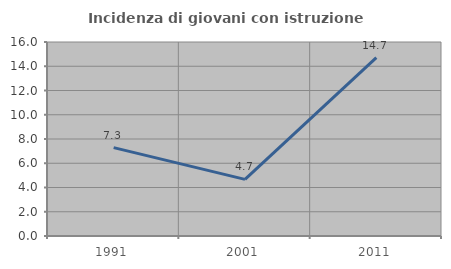
| Category | Incidenza di giovani con istruzione universitaria |
|---|---|
| 1991.0 | 7.292 |
| 2001.0 | 4.673 |
| 2011.0 | 14.706 |